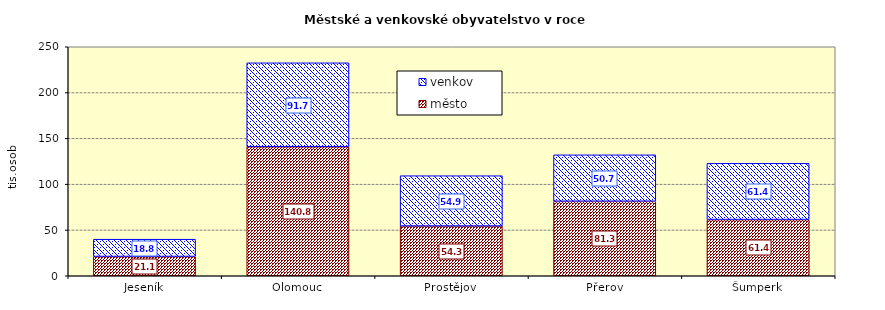
| Category | město | venkov |
|---|---|---|
| Jeseník | 21064 | 18846 |
| Olomouc | 140801 | 91673 |
| Prostějov | 54279 | 54944 |
| Přerov | 81342 | 50672 |
| Šumperk | 61350 | 61385 |